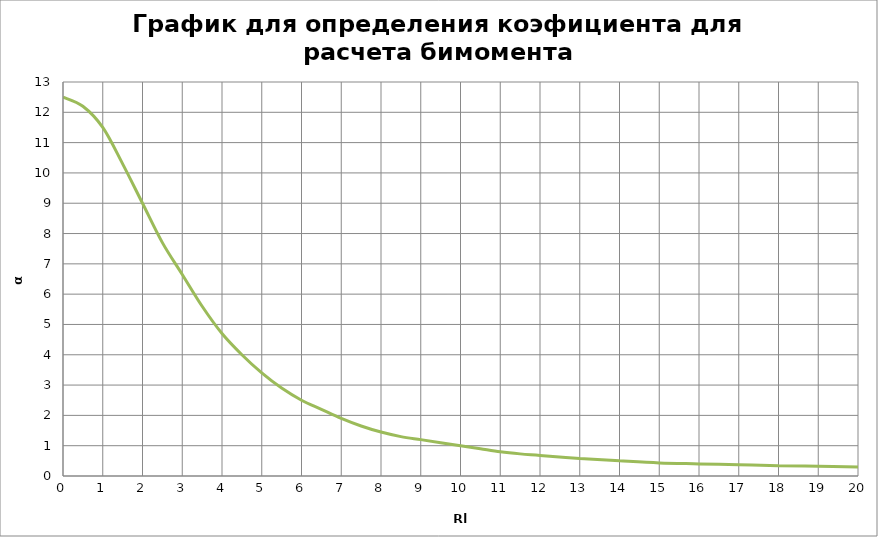
| Category | a |
|---|---|
| 0.0 | 12.5 |
| 0.5 | 12.2 |
| 1.0 | 11.5 |
| 1.5 | 10.3 |
| 2.0 | 9 |
| 2.5 | 7.7 |
| 3.0 | 6.65 |
| 3.5 | 5.6 |
| 4.0 | 4.7 |
| 4.5 | 4 |
| 5.0 | 3.4 |
| 5.5 | 2.9 |
| 6.0 | 2.5 |
| 6.5 | 2.2 |
| 7.0 | 1.9 |
| 7.5 | 1.65 |
| 8.0 | 1.45 |
| 8.5 | 1.3 |
| 9.0 | 1.2 |
| 9.5 | 1.1 |
| 10.0 | 1 |
| 10.5 | 0.9 |
| 11.0 | 0.8 |
| 11.5 | 0.73 |
| 12.0 | 0.68 |
| 13.0 | 0.58 |
| 14.0 | 0.5 |
| 15.0 | 0.43 |
| 16.0 | 0.4 |
| 17.0 | 0.37 |
| 18.0 | 0.34 |
| 19.0 | 0.32 |
| 20.0 | 0.3 |